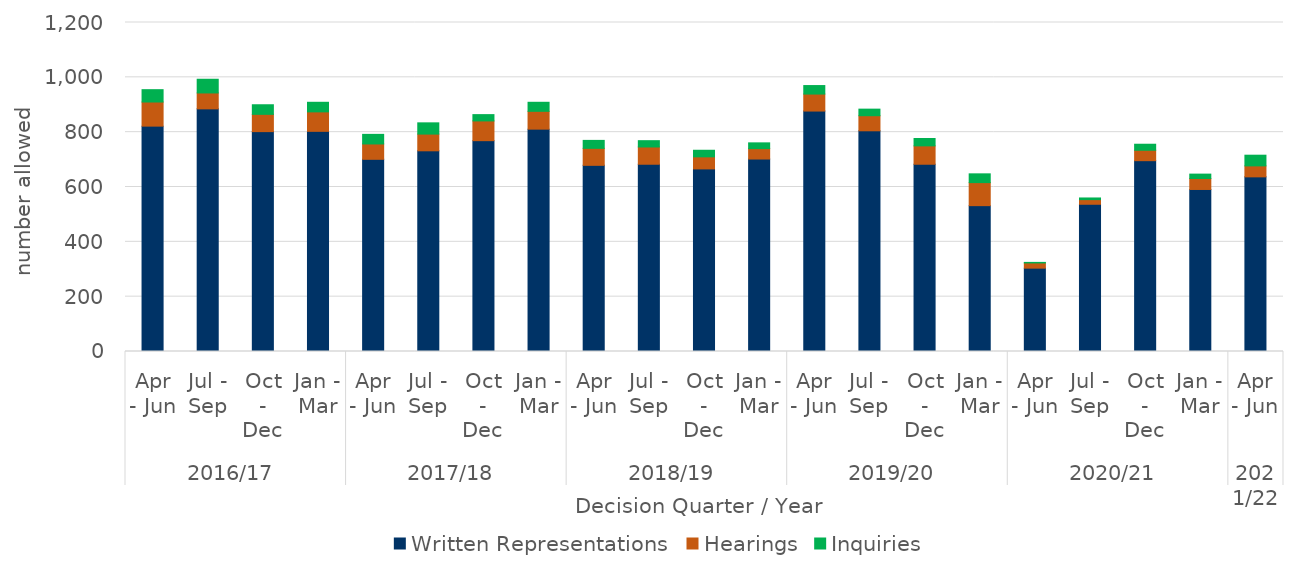
| Category | Written Representations | Hearings | Inquiries |
|---|---|---|---|
| 0 | 822 | 88 | 45 |
| 1 | 885 | 58 | 50 |
| 2 | 802 | 63 | 35 |
| 3 | 803 | 71 | 35 |
| 4 | 701 | 56 | 35 |
| 5 | 732 | 61 | 41 |
| 6 | 769 | 72 | 23 |
| 7 | 811 | 65 | 33 |
| 8 | 679 | 62 | 29 |
| 9 | 683 | 63 | 23 |
| 10 | 666 | 44 | 24 |
| 11 | 702 | 38 | 21 |
| 12 | 877 | 62 | 31 |
| 13 | 805 | 55 | 24 |
| 14 | 683 | 67 | 27 |
| 15 | 532 | 84 | 32 |
| 16 | 304 | 19 | 2 |
| 17 | 537 | 17 | 6 |
| 18 | 696 | 38 | 22 |
| 19 | 591 | 40 | 16 |
| 20 | 637 | 40 | 39 |